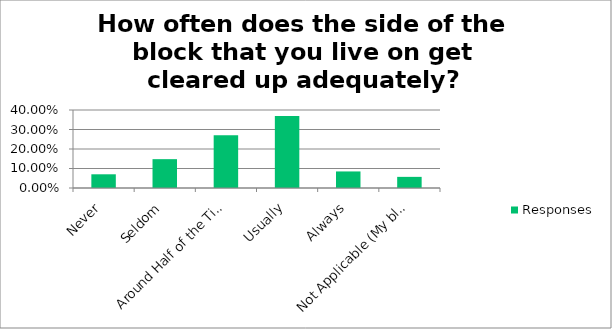
| Category | Responses |
|---|---|
| Never | 0.07 |
| Seldom | 0.148 |
| Around Half of the Time | 0.271 |
| Usually | 0.369 |
| Always | 0.085 |
| Not Applicable (My block does not have a sidewalk) | 0.057 |